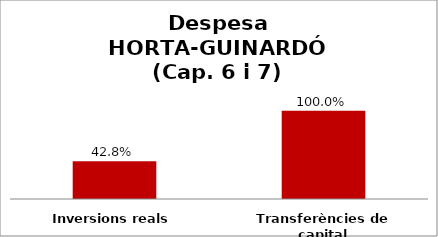
| Category | Series 0 |
|---|---|
| Inversions reals | 0.428 |
| Transferències de capital | 1 |